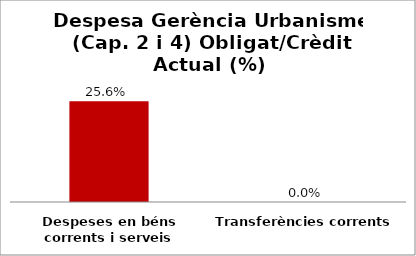
| Category | Series 0 |
|---|---|
| Despeses en béns corrents i serveis | 0.256 |
| Transferències corrents | 0 |